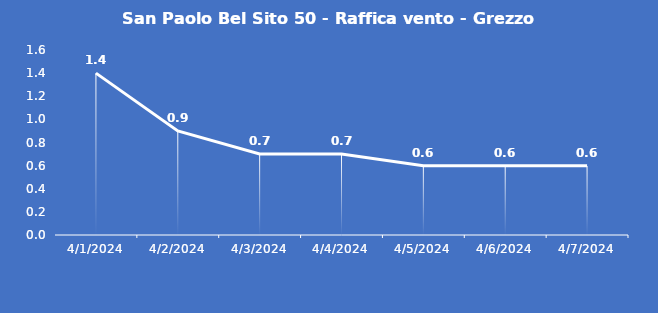
| Category | San Paolo Bel Sito 50 - Raffica vento - Grezzo (m/s) |
|---|---|
| 4/1/24 | 1.4 |
| 4/2/24 | 0.9 |
| 4/3/24 | 0.7 |
| 4/4/24 | 0.7 |
| 4/5/24 | 0.6 |
| 4/6/24 | 0.6 |
| 4/7/24 | 0.6 |